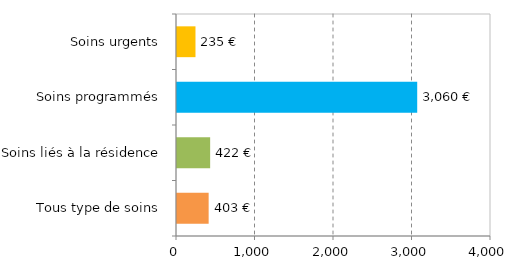
| Category | Series 0 |
|---|---|
| Tous type de soins | 403.163 |
| Soins liés à la résidence | 422.28 |
| Soins programmés | 3059.946 |
| Soins urgents | 235.442 |